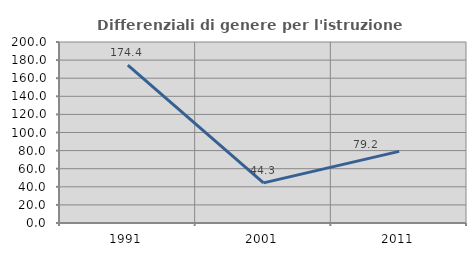
| Category | Differenziali di genere per l'istruzione superiore |
|---|---|
| 1991.0 | 174.359 |
| 2001.0 | 44.318 |
| 2011.0 | 79.167 |